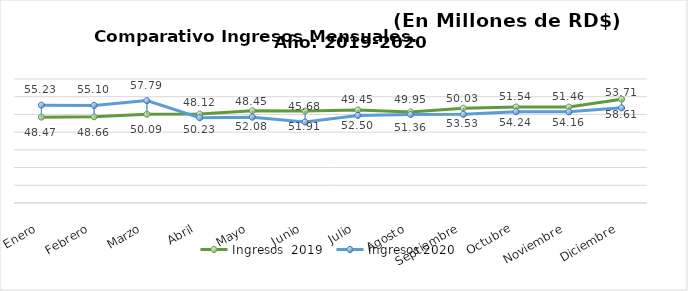
| Category | Ingresos  2019 | Ingresos 2020 |
|---|---|---|
| Enero | 48.474 | 55.226 |
| Febrero | 48.656 | 55.1 |
| Marzo | 50.087 | 57.79 |
| Abril | 50.227 | 48.12 |
| Mayo | 52.084 | 48.451 |
| Junio | 51.91 | 45.677 |
| Julio | 52.497 | 49.45 |
| Agosto | 51.358 | 49.952 |
| Septiembre | 53.53 | 50.032 |
| Octubre | 54.235 | 51.542 |
| Noviembre | 54.156 | 51.457 |
| Diciembre | 58.609 | 53.712 |